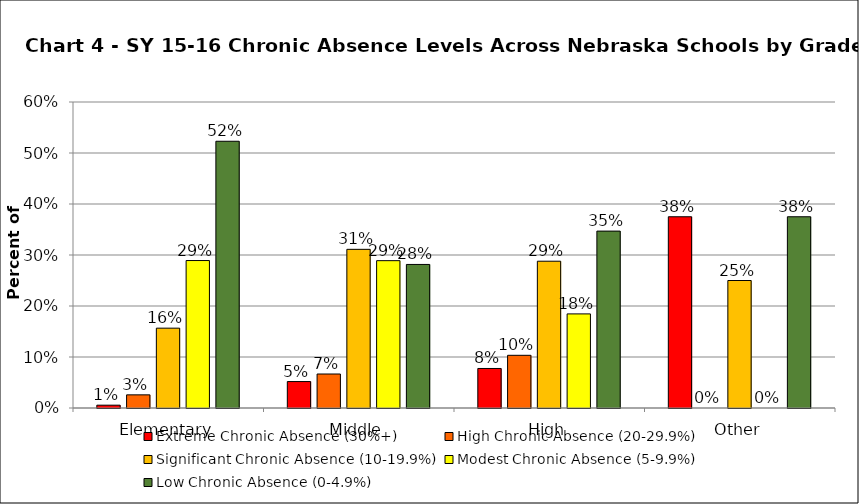
| Category | Extreme Chronic Absence (30%+) | High Chronic Absence (20-29.9%) | Significant Chronic Absence (10-19.9%) | Modest Chronic Absence (5-9.9%) | Low Chronic Absence (0-4.9%) |
|---|---|---|---|---|---|
| 0 | 0.006 | 0.026 | 0.157 | 0.289 | 0.523 |
| 1 | 0.052 | 0.067 | 0.311 | 0.289 | 0.281 |
| 2 | 0.077 | 0.103 | 0.288 | 0.185 | 0.347 |
| 3 | 0.375 | 0 | 0.25 | 0 | 0.375 |